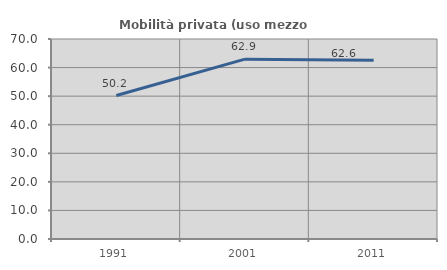
| Category | Mobilità privata (uso mezzo privato) |
|---|---|
| 1991.0 | 50.211 |
| 2001.0 | 62.939 |
| 2011.0 | 62.58 |